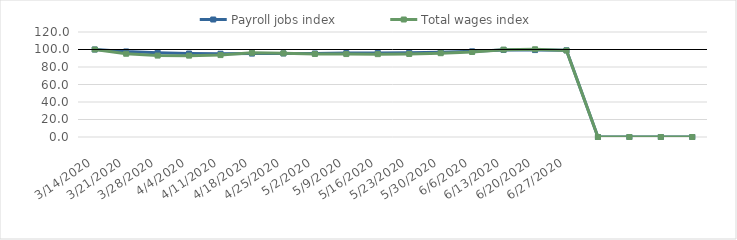
| Category | Payroll jobs index | Total wages index |
|---|---|---|
| 14/03/2020 | 100 | 100 |
| 21/03/2020 | 97.762 | 95.145 |
| 28/03/2020 | 96.354 | 93.046 |
| 04/04/2020 | 95.383 | 92.982 |
| 11/04/2020 | 95.162 | 93.615 |
| 18/04/2020 | 95.327 | 96.229 |
| 25/04/2020 | 95.484 | 95.62 |
| 02/05/2020 | 95.451 | 94.902 |
| 09/05/2020 | 95.884 | 94.8 |
| 16/05/2020 | 96.138 | 94.693 |
| 23/05/2020 | 96.326 | 94.89 |
| 30/05/2020 | 96.749 | 95.769 |
| 06/06/2020 | 97.87 | 97.166 |
| 13/06/2020 | 99.496 | 99.846 |
| 20/06/2020 | 99.347 | 100.24 |
| 27/06/2020 | 99.052 | 98.888 |